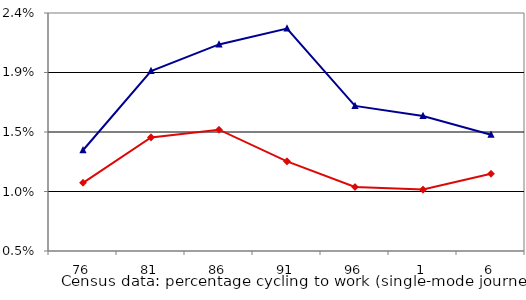
| Category | Series1 | Series2 |
|---|---|---|
| 0 | 0.01 | 0.013 |
| 1 | 0.014 | 0.019 |
| 2 | 0.015 | 0.021 |
| 3 | 0.012 | 0.023 |
| 4 | 0.01 | 0.017 |
| 5 | 0.01 | 0.016 |
| 6 | 0.011 | 0.014 |